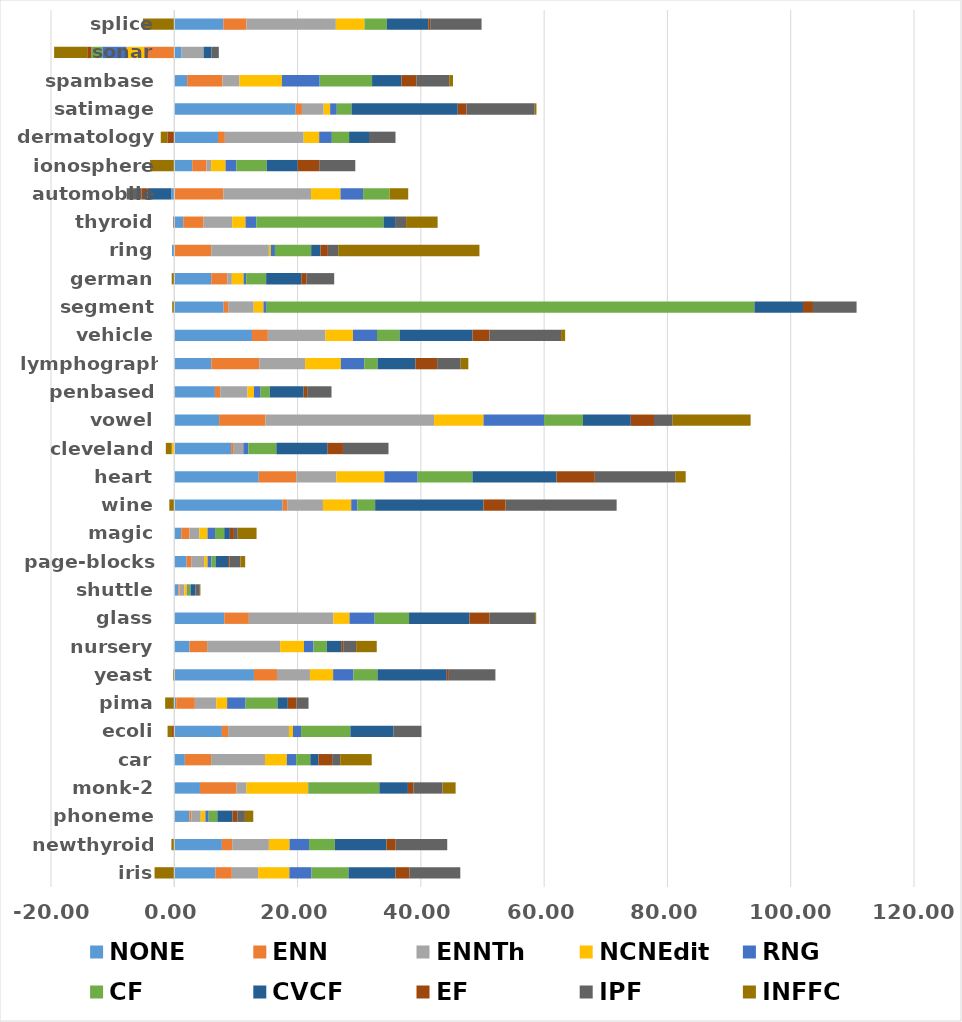
| Category | NONE | ENN | ENNTh | NCNEdit | RNG | CF | CVCF | EF | IPF | INFFC |
|---|---|---|---|---|---|---|---|---|---|---|
| iris | 6.667 | 2.667 | 4.267 | 5.067 | 3.6 | 6 | 7.6 | 2.267 | 8.267 | -3.2 |
| newthyroid | 7.721 | 1.674 | 5.953 | 3.349 | 3.163 | 4.186 | 8.372 | 1.488 | 8.372 | -0.465 |
| phoneme | 2.461 | 0.322 | 1.51 | 0.751 | 0.537 | 1.403 | 2.473 | 0.763 | 1.24 | 1.351 |
| monk-2 | 4.165 | 5.929 | 1.63 | 10.007 | 0.094 | 11.442 | 4.636 | 0.884 | 4.725 | 2.128 |
| car | 1.714 | 4.261 | 8.738 | 3.543 | 1.517 | 2.291 | 1.32 | 2.222 | 1.309 | 5.116 |
| ecoli | 7.723 | 1.01 | 9.87 | 0.654 | 1.308 | 7.998 | 6.963 | -0.363 | 4.572 | -0.725 |
| pima | 0.316 | 3.022 | 3.491 | 1.743 | 2.994 | 5.184 | 1.667 | 1.431 | 1.93 | -1.483 |
| yeast | 12.925 | 3.733 | 5.35 | 3.76 | 3.288 | 3.91 | 11.241 | 0.336 | 7.549 | -0.175 |
| nursery | 2.469 | 2.854 | 11.85 | 3.873 | 1.542 | 2.16 | 2.329 | 0.324 | 2.098 | 3.348 |
| glass | 8.106 | 3.991 | 13.728 | 2.6 | 4.086 | 5.573 | 9.803 | 3.271 | 7.382 | 0.168 |
| shuttle | 0.653 | 0.202 | 0.791 | 0.451 | 0.129 | 0.405 | 0.818 | 0.055 | 0.644 | 0.092 |
| page-blocks | 2.003 | 0.742 | 2.091 | 0.563 | 0.64 | 0.654 | 2.025 | 0.205 | 1.813 | 0.768 |
| magic | 1.128 | 1.346 | 1.61 | 1.306 | 1.222 | 1.492 | 0.912 | 0.656 | 0.619 | 3.054 |
| wine | 17.575 | 0.746 | 5.797 | 4.587 | 0.994 | 2.886 | 17.581 | 3.59 | 18.006 | -0.806 |
| heart | 13.704 | 6.074 | 6.519 | 7.778 | 5.407 | 8.889 | 13.63 | 6.222 | 13.037 | 1.704 |
| cleveland | 9.216 | 0.322 | 1.664 | -0.412 | 0.8 | 4.554 | 8.332 | 2.473 | 7.391 | -0.959 |
| vowel | 7.273 | 7.515 | 27.354 | 8.02 | 9.818 | 6.323 | 7.758 | 3.758 | 3.03 | 12.646 |
| penbased | 6.592 | 0.859 | 4.432 | 1.043 | 1.083 | 1.477 | 5.495 | 0.575 | 3.948 | -0.053 |
| lymphography | 6.009 | 7.789 | 7.43 | 5.798 | 3.789 | 2.179 | 6.115 | 3.531 | 3.825 | 1.237 |
| vehicle | 12.602 | 2.578 | 9.338 | 4.468 | 3.901 | 3.664 | 11.823 | 2.763 | 11.607 | 0.661 |
| segment | 8.009 | 0.736 | 4.139 | 1.584 | 0.528 | 79.117 | 7.879 | 1.619 | 7.074 | -0.338 |
| german | 6 | 2.6 | 0.74 | 1.9 | 0.42 | 3.24 | 5.7 | 0.88 | 4.46 | -0.42 |
| ring | -0.368 | 5.989 | 9.354 | 0.314 | 0.673 | 5.876 | 1.519 | 1.189 | 1.673 | 22.916 |
| thyroid | 1.453 | 3.3 | 4.642 | 2.158 | 1.761 | 20.639 | 1.864 | -0.169 | 1.789 | 5.114 |
| automobile | -0.5 | 7.96 | 14.226 | 4.778 | 3.665 | 4.31 | -3.875 | -0.964 | -2.383 | 3.012 |
| ionosphere | 2.905 | 2.332 | 0.739 | 2.34 | 1.762 | 4.901 | 5.052 | 3.481 | 5.853 | -3.93 |
| dermatology | 7.093 | 1.11 | 12.788 | 2.512 | 2.057 | 2.796 | 3.235 | -1.124 | 4.296 | -1.072 |
| satimage | 19.699 | 1.01 | 3.524 | 1.051 | 1.078 | 2.399 | 17.225 | 1.408 | 11.077 | 0.283 |
| spambase | 2.092 | 5.734 | 2.745 | 6.887 | 6.13 | 8.497 | 4.772 | 2.458 | 5.278 | 0.622 |
| sonar | 1.187 | -4.894 | 3.566 | -2.862 | -3.916 | -1.786 | 1.282 | -0.664 | 1.187 | -5.37 |
| splice | 7.956 | 3.755 | 14.5 | 4.638 | -0.015 | 3.638 | 6.711 | 0.313 | 8.335 | -5.073 |